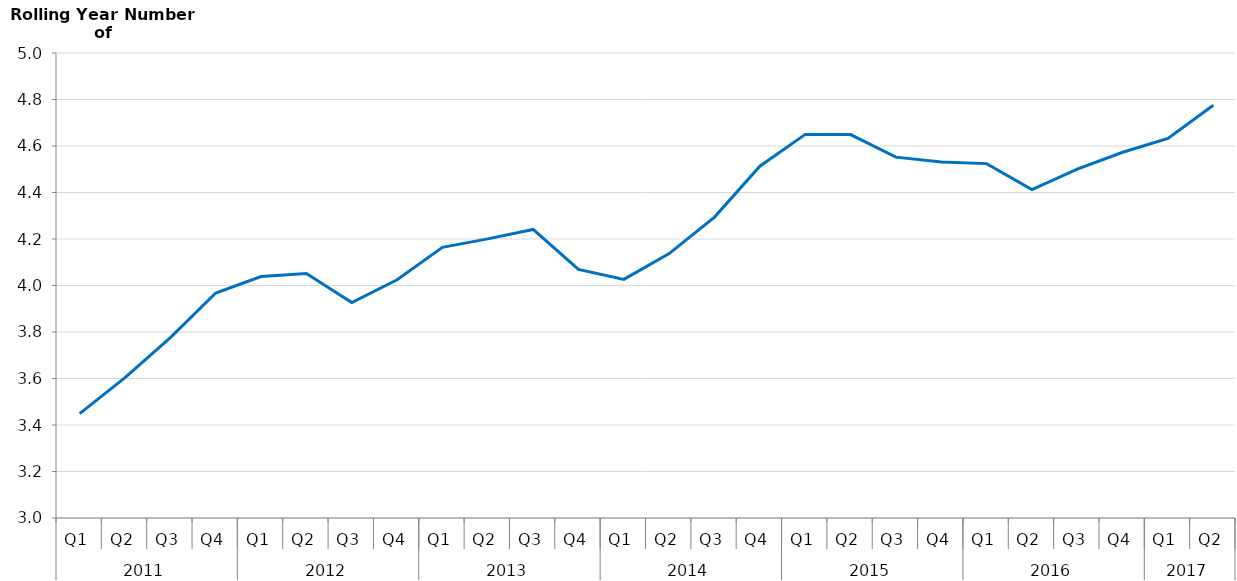
| Category | Rolling Year Overnight Trips  |
|---|---|
| 0 | 3449234.585 |
| 1 | 3603503.025 |
| 2 | 3776061.835 |
| 3 | 3967762.023 |
| 4 | 4038429.282 |
| 5 | 4051615.143 |
| 6 | 3926598.037 |
| 7 | 4024504.999 |
| 8 | 4164220.885 |
| 9 | 4200581.796 |
| 10 | 4241056.555 |
| 11 | 4069440.424 |
| 12 | 4026459.687 |
| 13 | 4137374.729 |
| 14 | 4294428.3 |
| 15 | 4513146.4 |
| 16 | 4649933.446 |
| 17 | 4649322.249 |
| 18 | 4552115.024 |
| 19 | 4531617.984 |
| 20 | 4524205.299 |
| 21 | 4412394.417 |
| 22 | 4500506.255 |
| 23 | 4572940.408 |
| 24 | 4632852.43 |
| 25 | 4775030.673 |